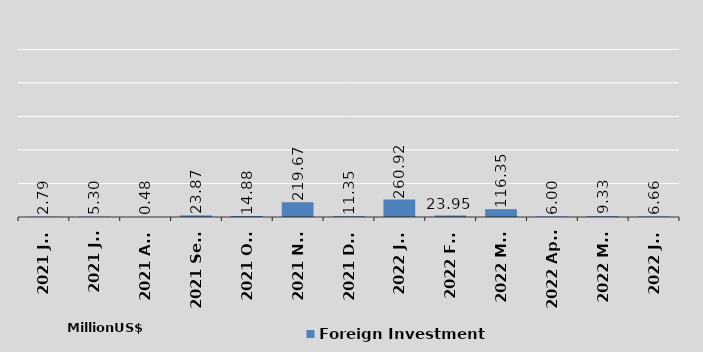
| Category | Foreign Investment |
|---|---|
| 2021 Jun | 2.79 |
| 2021 Jul | 5.3 |
| 2021 Aug | 0.48 |
| 2021 Sept | 23.87 |
| 2021 Oct | 14.88 |
| 2021 Nov | 219.67 |
| 2021 Dec | 11.35 |
| 2022 Jan | 260.92 |
| 2022 Feb | 23.95 |
| 2022 Mar | 116.35 |
| 2022 April | 6 |
| 2022 May | 9.33 |
| 2022 Jun | 6.66 |